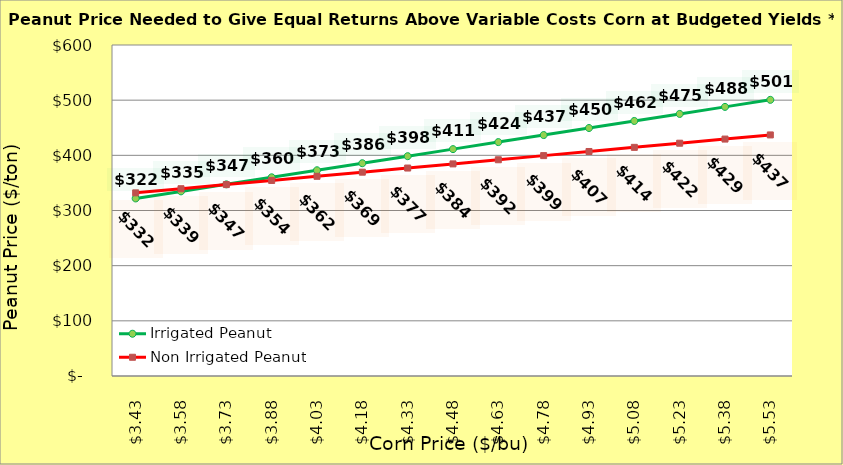
| Category | Irrigated Peanut | Non Irrigated Peanut |
|---|---|---|
| 3.4299999999999997 | 321.869 | 331.972 |
| 3.5799999999999996 | 334.635 | 339.472 |
| 3.7299999999999995 | 347.401 | 346.972 |
| 3.8799999999999994 | 360.167 | 354.472 |
| 4.029999999999999 | 372.933 | 361.972 |
| 4.18 | 385.699 | 369.472 |
| 4.33 | 398.465 | 376.972 |
| 4.48 | 411.231 | 384.472 |
| 4.630000000000001 | 423.997 | 391.972 |
| 4.780000000000001 | 436.763 | 399.472 |
| 4.9300000000000015 | 449.529 | 406.972 |
| 5.080000000000002 | 462.294 | 414.472 |
| 5.230000000000002 | 475.06 | 421.972 |
| 5.380000000000003 | 487.826 | 429.472 |
| 5.530000000000003 | 500.592 | 436.972 |